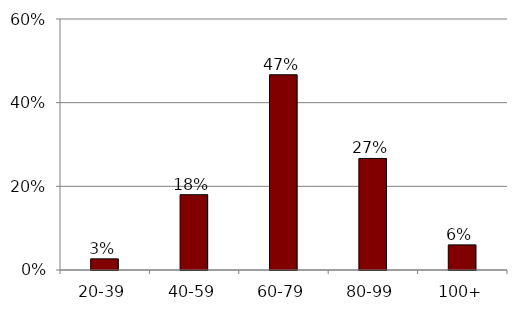
| Category | Series 0 |
|---|---|
| 20-39 | 0.027 |
| 40-59 | 0.18 |
| 60-79 | 0.467 |
| 80-99 | 0.267 |
| 100+ | 0.06 |